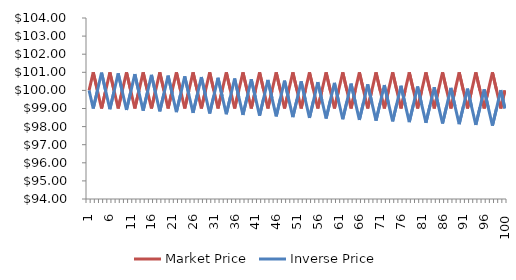
| Category | Market Price | Inverse Price |
|---|---|---|
| 1.0 | 100 | 100 |
| 2.0 | 101 | 99 |
| 3.0 | 100 | 99.98 |
| 4.0 | 99 | 100.98 |
| 5.0 | 100 | 99.96 |
| 6.0 | 101 | 98.96 |
| 7.0 | 100 | 99.94 |
| 8.0 | 99 | 100.94 |
| 9.0 | 100 | 99.92 |
| 10.0 | 101 | 98.921 |
| 11.0 | 100 | 99.9 |
| 12.0 | 99 | 100.899 |
| 13.0 | 100 | 99.88 |
| 14.0 | 101 | 98.881 |
| 15.0 | 100 | 99.86 |
| 16.0 | 99 | 100.859 |
| 17.0 | 100 | 99.84 |
| 18.0 | 101 | 98.842 |
| 19.0 | 100 | 99.82 |
| 20.0 | 99 | 100.819 |
| 21.0 | 100 | 99.8 |
| 22.0 | 101 | 98.802 |
| 23.0 | 100 | 99.78 |
| 24.0 | 99 | 100.778 |
| 25.0 | 100 | 99.76 |
| 26.0 | 101 | 98.763 |
| 27.0 | 100 | 99.74 |
| 28.0 | 99 | 100.738 |
| 29.0 | 100 | 99.72 |
| 30.0 | 101 | 98.723 |
| 31.0 | 100 | 99.701 |
| 32.0 | 99 | 100.698 |
| 33.0 | 100 | 99.68 |
| 34.0 | 101 | 98.684 |
| 35.0 | 100 | 99.661 |
| 36.0 | 99 | 100.657 |
| 37.0 | 100 | 99.641 |
| 38.0 | 101 | 98.644 |
| 39.0 | 100 | 99.621 |
| 40.0 | 99 | 100.617 |
| 41.0 | 100 | 99.601 |
| 42.0 | 101 | 98.605 |
| 43.0 | 100 | 99.581 |
| 44.0 | 99 | 100.577 |
| 45.0 | 100 | 99.561 |
| 46.0 | 101 | 98.565 |
| 47.0 | 100 | 99.541 |
| 48.0 | 99 | 100.537 |
| 49.0 | 100 | 99.521 |
| 50.0 | 101 | 98.526 |
| 51.0 | 100 | 99.501 |
| 52.0 | 99 | 100.496 |
| 53.0 | 100 | 99.481 |
| 54.0 | 101 | 98.486 |
| 55.0 | 100 | 99.462 |
| 56.0 | 99 | 100.456 |
| 57.0 | 100 | 99.441 |
| 58.0 | 101 | 98.447 |
| 59.0 | 100 | 99.422 |
| 60.0 | 99 | 100.416 |
| 61.0 | 100 | 99.402 |
| 62.0 | 101 | 98.408 |
| 63.0 | 100 | 99.382 |
| 64.0 | 99 | 100.376 |
| 65.0 | 100 | 99.362 |
| 66.0 | 101 | 98.368 |
| 67.0 | 100 | 99.342 |
| 68.0 | 99 | 100.336 |
| 69.0 | 100 | 99.322 |
| 70.0 | 101 | 98.329 |
| 71.0 | 100 | 99.303 |
| 72.0 | 99 | 100.296 |
| 73.0 | 100 | 99.282 |
| 74.0 | 101 | 98.29 |
| 75.0 | 100 | 99.263 |
| 76.0 | 99 | 100.255 |
| 77.0 | 100 | 99.243 |
| 78.0 | 101 | 98.25 |
| 79.0 | 100 | 99.223 |
| 80.0 | 99 | 100.215 |
| 81.0 | 100 | 99.203 |
| 82.0 | 101 | 98.211 |
| 83.0 | 100 | 99.183 |
| 84.0 | 99 | 100.175 |
| 85.0 | 100 | 99.163 |
| 86.0 | 101 | 98.172 |
| 87.0 | 100 | 99.144 |
| 88.0 | 99 | 100.135 |
| 89.0 | 100 | 99.124 |
| 90.0 | 101 | 98.132 |
| 91.0 | 100 | 99.104 |
| 92.0 | 99 | 100.095 |
| 93.0 | 100 | 99.084 |
| 94.0 | 101 | 98.093 |
| 95.0 | 100 | 99.064 |
| 96.0 | 99 | 100.055 |
| 97.0 | 100 | 99.044 |
| 98.0 | 101 | 98.054 |
| 99.0 | 100 | 99.025 |
| 100.0 | 99 | 100.015 |
| 100.0 | 100 | 99.005 |